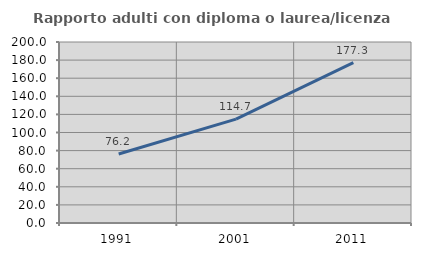
| Category | Rapporto adulti con diploma o laurea/licenza media  |
|---|---|
| 1991.0 | 76.224 |
| 2001.0 | 114.749 |
| 2011.0 | 177.259 |